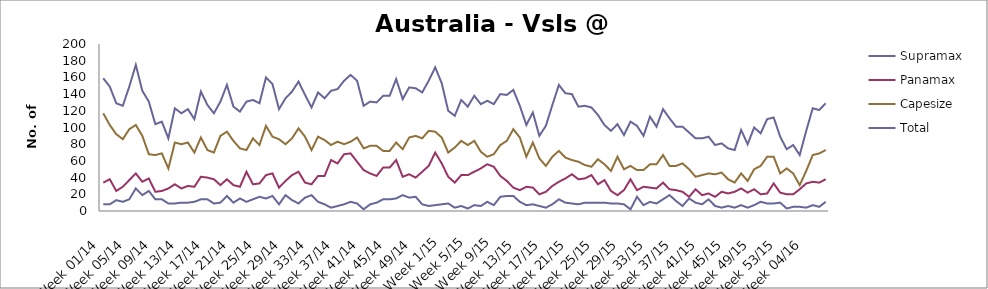
| Category | Supramax | Panamax | Capesize | Total |
|---|---|---|---|---|
| Week 01/14 | 8 | 34 | 117 | 159 |
| Week 02/14 | 8 | 38 | 103 | 149 |
| Week 03/14 | 13 | 24 | 92 | 129 |
| Week 04/14 | 11 | 29 | 86 | 126 |
| Week 05/14 | 14 | 37 | 98 | 149 |
| Week 06/14 | 27 | 45 | 103 | 175 |
| Week 07/14 | 19 | 35 | 90 | 144 |
| Week 08/14 | 24 | 39 | 68 | 131 |
| Week 09/14 | 14 | 23 | 67 | 104 |
| Week 10/14 | 14 | 24 | 69 | 107 |
| Week 11/14 | 9 | 27 | 51 | 87 |
| Week 12/14 | 9 | 32 | 82 | 123 |
| Week 13/14 | 10 | 27 | 80 | 117 |
| Week 14/14 | 10 | 30 | 82 | 122 |
| Week 15/14 | 11 | 29 | 70 | 110 |
| Week 16/14 | 14 | 41 | 88 | 143 |
| Week 17/14 | 14 | 40 | 73 | 127 |
| Week 18/14 | 9 | 38 | 70 | 117 |
| Week 19/14 | 10 | 31 | 90 | 131 |
| Week 20/14 | 18 | 38 | 95 | 151 |
| Week 21/14 | 10 | 31 | 84 | 125 |
| Week 22/14 | 15 | 29 | 75 | 119 |
| Week 23/14 | 11 | 47 | 73 | 131 |
| Week 24/14 | 14 | 32 | 87 | 133 |
| Week 25/14 | 17 | 33 | 79 | 129 |
| Week 26/14 | 15 | 43 | 102 | 160 |
| Week 27/14 | 18 | 45 | 89 | 152 |
| Week 28/14 | 8 | 28 | 86 | 122 |
| Week 29/14 | 19 | 36 | 80 | 135 |
| Week 30/14 | 13 | 43 | 87 | 143 |
| Week 31/14 | 9 | 47 | 99 | 155 |
| Week 32/14 | 16 | 34 | 89 | 139 |
| Week 33/14 | 19 | 32 | 73 | 124 |
| Week 34/14 | 11 | 42 | 89 | 142 |
| Week 35/14 | 8 | 42 | 85 | 135 |
| Week 36/14 | 4 | 61 | 79 | 144 |
| Week 37/14 | 6 | 57 | 83 | 146 |
| Week 38/14 | 8 | 68 | 80 | 156 |
| Week 39/14 | 11 | 69 | 83 | 163 |
| Week 40/14 | 9 | 59 | 88 | 156 |
| Week 41/14 | 2 | 49 | 75 | 126 |
| Week 42/14 | 8 | 45 | 78 | 131 |
| Week 43/14 | 10 | 42 | 78 | 130 |
| Week 44/14 | 14 | 52 | 72 | 138 |
| Week 45/14 | 14 | 52 | 72 | 138 |
| Week 46/14 | 15 | 61 | 82 | 158 |
| Week 47/14 | 19 | 41 | 74 | 134 |
| Week 48/14 | 16 | 44 | 88 | 148 |
| Week 49/14 | 17 | 40 | 90 | 147 |
| Week 50/14 | 8 | 47 | 87 | 142 |
| Week 51/14 | 6 | 54 | 96 | 156 |
| Week 52/14 | 7 | 70 | 95 | 172 |
| Week 1/15 | 8 | 57 | 88 | 153 |
| Week 2/15 | 9 | 41 | 70 | 120 |
| Week 3/15 | 4 | 34 | 76 | 114 |
| Week 4/15 | 6 | 43 | 84 | 133 |
| Week 5/15 | 3 | 43 | 79 | 125 |
| Week 6/15 | 7 | 47 | 84 | 138 |
| Week 7/15 | 6 | 51 | 71 | 128 |
| Week 8/15 | 11 | 56 | 65 | 132 |
| Week 9/15 | 7 | 53 | 68 | 128 |
| Week 10/15 | 17 | 42 | 79 | 140 |
| Week 11/15 | 18 | 36 | 84 | 139 |
| Week 12/15 | 18 | 28 | 98 | 145 |
| Week 13/15 | 11 | 25 | 88 | 126 |
| Week 14/15 | 7 | 29 | 65 | 103 |
| Week 15/15 | 8 | 28 | 82 | 118 |
| Week 16/15 | 6 | 20 | 63 | 90 |
| Week 17/15 | 4 | 23 | 54 | 102 |
| Week 18/15 | 8 | 30 | 65 | 127 |
| Week 19/15 | 14 | 35 | 72 | 151 |
| Week 20/15 | 10 | 39 | 64 | 141 |
| Week 21/15 | 9 | 44 | 61 | 140 |
| Week 22/15 | 8 | 38 | 59 | 125 |
| Week 23/15 | 10 | 39 | 55 | 126 |
| Week 24/15 | 10 | 43 | 53 | 124 |
| Week 25/15 | 10 | 32 | 62 | 115 |
| Week 26/15 | 10 | 37 | 56 | 103 |
| Week 27/15 | 9 | 24 | 48 | 96 |
| Week 28/15 | 9 | 19 | 65 | 104 |
| Week 29/15 | 8 | 25 | 50 | 91 |
| Week 30/15 | 2 | 38 | 54 | 107 |
| Week 31/15 | 17 | 25 | 49 | 102 |
| Week 32/15 | 7 | 29 | 49 | 90 |
| Week 33/15 | 11 | 28 | 56 | 113 |
| Week 34/15 | 9 | 27 | 56 | 101 |
| Week 35/15 | 14 | 34 | 67 | 122 |
| Week 36/15 | 19 | 26 | 54 | 111 |
| Week 37/15 | 12 | 25 | 54 | 101 |
| Week 38/15 | 6 | 23 | 57 | 101 |
| Week 39/15 | 15 | 17 | 50 | 94 |
| Week 40/15 | 10 | 26 | 41 | 87 |
| Week 41/15 | 8 | 19 | 43 | 87 |
| Week 42/15 | 14 | 21 | 45 | 89 |
| Week 43/15 | 6 | 17 | 44 | 79 |
| Week 44/15 | 4 | 23 | 46 | 81 |
| Week 45/15 | 6 | 21 | 38 | 75 |
| Week 46/15 | 4 | 23 | 34 | 73 |
| Week 47/15 | 7 | 27 | 45 | 97 |
| Week 48/15 | 4 | 22 | 36 | 80 |
| Week 49/15 | 7 | 26 | 50 | 100 |
| Week 50/15 | 11 | 20 | 54 | 93 |
| Week 51/15 | 9 | 21 | 65 | 110 |
| Week 52/15 | 9 | 33 | 65 | 112 |
| Week 53/15 | 10 | 22 | 45 | 89 |
| Week 01/16 | 3 | 20 | 51 | 74 |
| Week 02/16 | 5 | 20 | 45 | 79 |
| Week 03/16 | 5 | 26 | 31 | 67 |
| Week 04/16 | 4 | 33 | 48 | 96 |
| Week 05/16 | 7 | 35 | 67 | 123 |
| Week 06/16 | 5 | 34 | 69 | 121 |
| Week 07/16 | 11 | 38 | 73 | 129 |